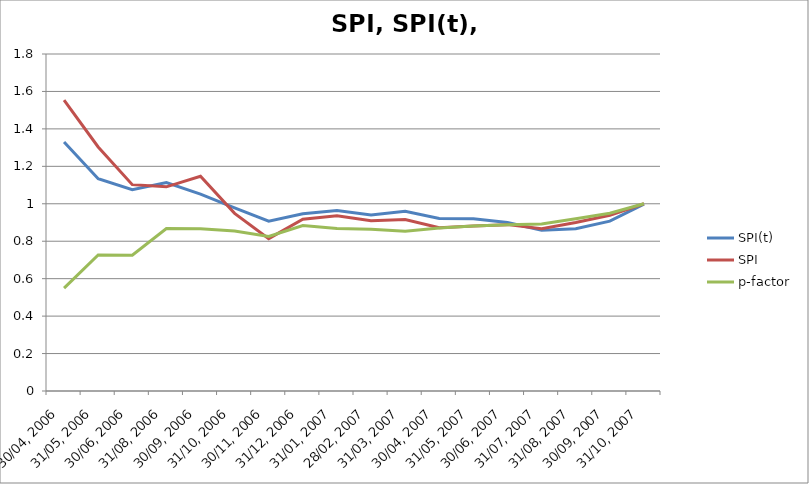
| Category | SPI(t) | SPI | p-factor |
|---|---|---|---|
| 30/04, 2006 | 1.33 | 1.554 | 0.55 |
| 31/05, 2006 | 1.134 | 1.303 | 0.727 |
| 30/06, 2006 | 1.075 | 1.102 | 0.725 |
| 31/08, 2006 | 1.114 | 1.09 | 0.868 |
| 30/09, 2006 | 1.052 | 1.147 | 0.866 |
| 31/10, 2006 | 0.978 | 0.949 | 0.855 |
| 30/11, 2006 | 0.907 | 0.814 | 0.826 |
| 31/12, 2006 | 0.947 | 0.917 | 0.884 |
| 31/01, 2007 | 0.964 | 0.936 | 0.867 |
| 28/02, 2007 | 0.941 | 0.91 | 0.864 |
| 31/03, 2007 | 0.96 | 0.916 | 0.853 |
| 30/04, 2007 | 0.921 | 0.872 | 0.871 |
| 31/05, 2007 | 0.92 | 0.881 | 0.881 |
| 30/06, 2007 | 0.9 | 0.889 | 0.887 |
| 31/07, 2007 | 0.858 | 0.867 | 0.892 |
| 31/08, 2007 | 0.867 | 0.9 | 0.92 |
| 30/09, 2007 | 0.907 | 0.939 | 0.95 |
| 31/10, 2007 | 0.998 | 1 | 1 |